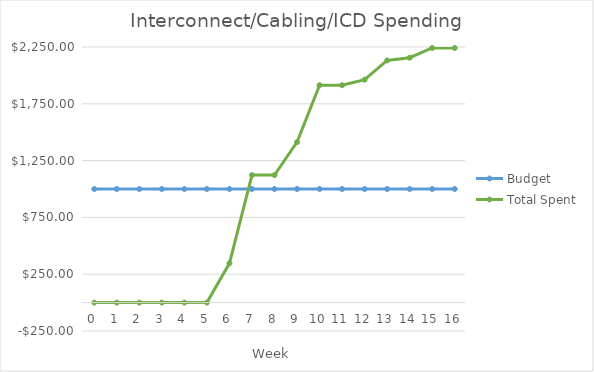
| Category | Budget | Total Spent |
|---|---|---|
| 0.0 | 1000 | 0 |
| 1.0 | 1000 | 0 |
| 2.0 | 1000 | 0 |
| 3.0 | 1000 | 0 |
| 4.0 | 1000 | 0 |
| 5.0 | 1000 | 0 |
| 6.0 | 1000 | 345.33 |
| 7.0 | 1000 | 1122.2 |
| 8.0 | 1000 | 1122.2 |
| 9.0 | 1000 | 1412.36 |
| 10.0 | 1000 | 1913.85 |
| 11.0 | 1000 | 1913.85 |
| 12.0 | 1000 | 1962.09 |
| 13.0 | 1000 | 2131.37 |
| 14.0 | 1000 | 2155.77 |
| 15.0 | 1000 | 2241.52 |
| 16.0 | 1000 | 2241.52 |